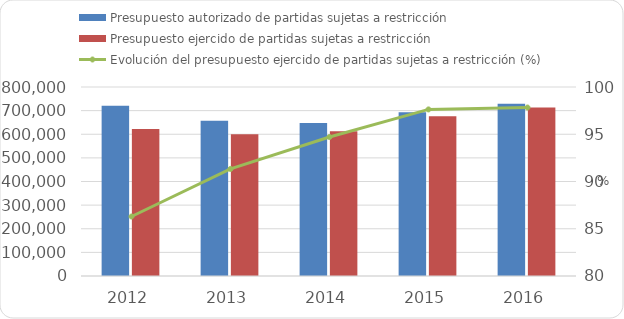
| Category | Presupuesto autorizado de partidas sujetas a restricción | Presupuesto ejercido de partidas sujetas a restricción  |
|---|---|---|
| 2012 | 720679.2 | 621909.5 |
| 2013 | 657148.1 | 600163.1 |
| 2014 | 647302.9 | 613052.1 |
| 2015 | 692840.462 | 676403.338 |
| 2016 | 729594.261 | 713725.8 |